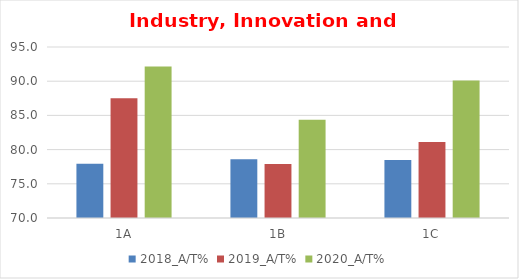
| Category | 2018_A/T% | 2019_A/T% | 2020_A/T% |
|---|---|---|---|
| 1A | 77.922 | 87.5 | 92.135 |
| 1B | 78.571 | 77.895 | 84.375 |
| 1C | 78.481 | 81.111 | 90.11 |